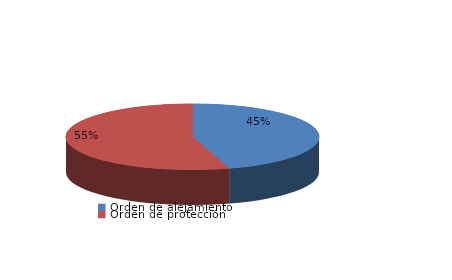
| Category | Series 0 |
|---|---|
| Orden de alejamiento | 53 |
| Orden de protección | 64 |